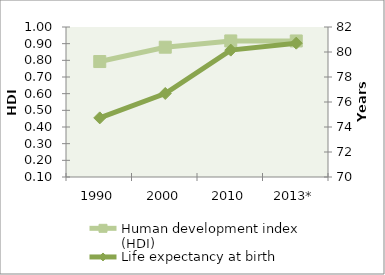
| Category | Human development index (HDI) |
|---|---|
| 1990 | 0.793 |
| 2000 | 0.879 |
| 2010 | 0.916 |
| 2013* | 0.916 |